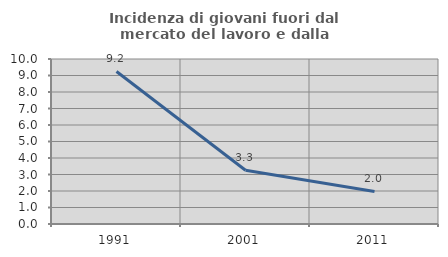
| Category | Incidenza di giovani fuori dal mercato del lavoro e dalla formazione  |
|---|---|
| 1991.0 | 9.244 |
| 2001.0 | 3.261 |
| 2011.0 | 1.974 |